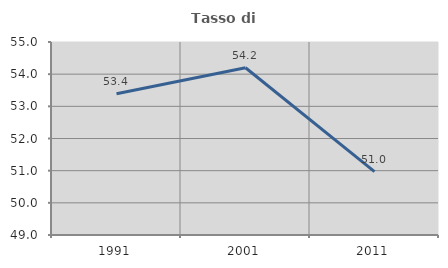
| Category | Tasso di occupazione   |
|---|---|
| 1991.0 | 53.388 |
| 2001.0 | 54.199 |
| 2011.0 | 50.968 |